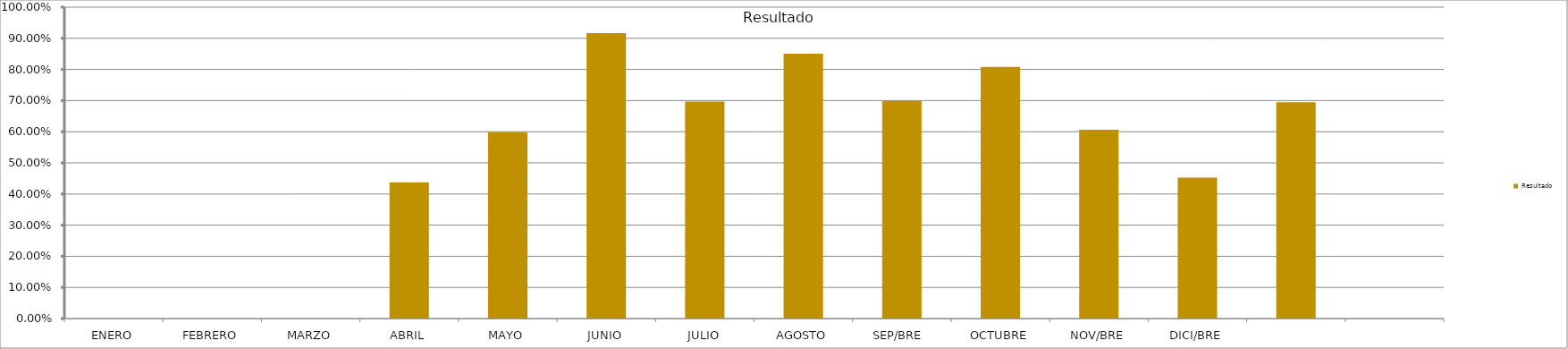
| Category | Resultado  |
|---|---|
| ENERO | 0 |
| FEBRERO | 0 |
| MARZO | 0 |
| ABRIL | 0.437 |
| MAYO | 0.599 |
| JUNIO | 0.917 |
| JULIO | 0.697 |
| AGOSTO | 0.851 |
| SEP/BRE  | 0.699 |
| OCTUBRE | 0.808 |
| NOV/BRE | 0.606 |
| DICI/BRE | 0.452 |